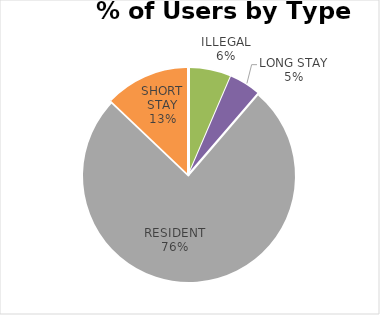
| Category | CAMBRIAN ROAD |
|---|---|
| COMMUTER | 0 |
| ILLEGAL | 4 |
| LONG STAY | 3 |
| RESIDENT | 47 |
| SHORT STAY | 8 |
| DISABLED | 0 |
| OTHER | 0 |